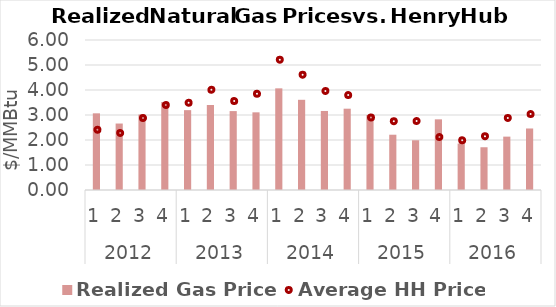
| Category | Realized Gas Price |
|---|---|
| 0 | 3.067 |
| 1 | 2.659 |
| 2 | 3.02 |
| 3 | 3.518 |
| 4 | 3.194 |
| 5 | 3.401 |
| 6 | 3.156 |
| 7 | 3.107 |
| 8 | 4.066 |
| 9 | 3.608 |
| 10 | 3.161 |
| 11 | 3.252 |
| 12 | 3.001 |
| 13 | 2.211 |
| 14 | 1.989 |
| 15 | 2.827 |
| 16 | 1.858 |
| 17 | 1.71 |
| 18 | 2.135 |
| 19 | 2.461 |